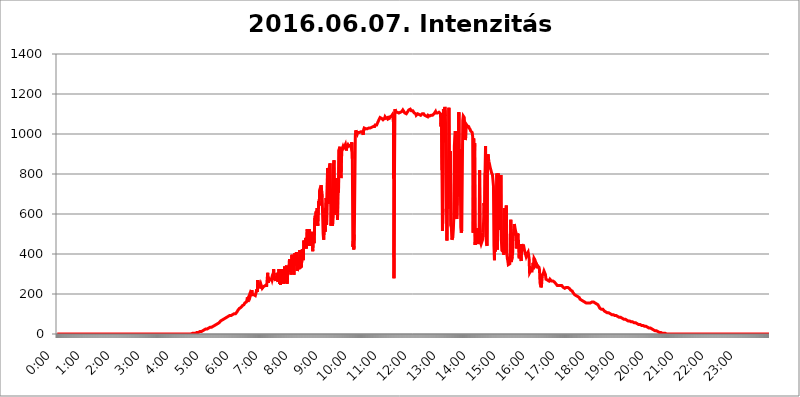
| Category | 2016.06.07. Intenzitás [W/m^2] |
|---|---|
| 0.0 | 0 |
| 0.0006944444444444445 | 0 |
| 0.001388888888888889 | 0 |
| 0.0020833333333333333 | 0 |
| 0.002777777777777778 | 0 |
| 0.003472222222222222 | 0 |
| 0.004166666666666667 | 0 |
| 0.004861111111111111 | 0 |
| 0.005555555555555556 | 0 |
| 0.0062499999999999995 | 0 |
| 0.006944444444444444 | 0 |
| 0.007638888888888889 | 0 |
| 0.008333333333333333 | 0 |
| 0.009027777777777779 | 0 |
| 0.009722222222222222 | 0 |
| 0.010416666666666666 | 0 |
| 0.011111111111111112 | 0 |
| 0.011805555555555555 | 0 |
| 0.012499999999999999 | 0 |
| 0.013194444444444444 | 0 |
| 0.013888888888888888 | 0 |
| 0.014583333333333332 | 0 |
| 0.015277777777777777 | 0 |
| 0.015972222222222224 | 0 |
| 0.016666666666666666 | 0 |
| 0.017361111111111112 | 0 |
| 0.018055555555555557 | 0 |
| 0.01875 | 0 |
| 0.019444444444444445 | 0 |
| 0.02013888888888889 | 0 |
| 0.020833333333333332 | 0 |
| 0.02152777777777778 | 0 |
| 0.022222222222222223 | 0 |
| 0.02291666666666667 | 0 |
| 0.02361111111111111 | 0 |
| 0.024305555555555556 | 0 |
| 0.024999999999999998 | 0 |
| 0.025694444444444447 | 0 |
| 0.02638888888888889 | 0 |
| 0.027083333333333334 | 0 |
| 0.027777777777777776 | 0 |
| 0.02847222222222222 | 0 |
| 0.029166666666666664 | 0 |
| 0.029861111111111113 | 0 |
| 0.030555555555555555 | 0 |
| 0.03125 | 0 |
| 0.03194444444444445 | 0 |
| 0.03263888888888889 | 0 |
| 0.03333333333333333 | 0 |
| 0.034027777777777775 | 0 |
| 0.034722222222222224 | 0 |
| 0.035416666666666666 | 0 |
| 0.036111111111111115 | 0 |
| 0.03680555555555556 | 0 |
| 0.0375 | 0 |
| 0.03819444444444444 | 0 |
| 0.03888888888888889 | 0 |
| 0.03958333333333333 | 0 |
| 0.04027777777777778 | 0 |
| 0.04097222222222222 | 0 |
| 0.041666666666666664 | 0 |
| 0.042361111111111106 | 0 |
| 0.04305555555555556 | 0 |
| 0.043750000000000004 | 0 |
| 0.044444444444444446 | 0 |
| 0.04513888888888889 | 0 |
| 0.04583333333333334 | 0 |
| 0.04652777777777778 | 0 |
| 0.04722222222222222 | 0 |
| 0.04791666666666666 | 0 |
| 0.04861111111111111 | 0 |
| 0.049305555555555554 | 0 |
| 0.049999999999999996 | 0 |
| 0.05069444444444445 | 0 |
| 0.051388888888888894 | 0 |
| 0.052083333333333336 | 0 |
| 0.05277777777777778 | 0 |
| 0.05347222222222222 | 0 |
| 0.05416666666666667 | 0 |
| 0.05486111111111111 | 0 |
| 0.05555555555555555 | 0 |
| 0.05625 | 0 |
| 0.05694444444444444 | 0 |
| 0.057638888888888885 | 0 |
| 0.05833333333333333 | 0 |
| 0.05902777777777778 | 0 |
| 0.059722222222222225 | 0 |
| 0.06041666666666667 | 0 |
| 0.061111111111111116 | 0 |
| 0.06180555555555556 | 0 |
| 0.0625 | 0 |
| 0.06319444444444444 | 0 |
| 0.06388888888888888 | 0 |
| 0.06458333333333334 | 0 |
| 0.06527777777777778 | 0 |
| 0.06597222222222222 | 0 |
| 0.06666666666666667 | 0 |
| 0.06736111111111111 | 0 |
| 0.06805555555555555 | 0 |
| 0.06874999999999999 | 0 |
| 0.06944444444444443 | 0 |
| 0.07013888888888889 | 0 |
| 0.07083333333333333 | 0 |
| 0.07152777777777779 | 0 |
| 0.07222222222222223 | 0 |
| 0.07291666666666667 | 0 |
| 0.07361111111111111 | 0 |
| 0.07430555555555556 | 0 |
| 0.075 | 0 |
| 0.07569444444444444 | 0 |
| 0.0763888888888889 | 0 |
| 0.07708333333333334 | 0 |
| 0.07777777777777778 | 0 |
| 0.07847222222222222 | 0 |
| 0.07916666666666666 | 0 |
| 0.0798611111111111 | 0 |
| 0.08055555555555556 | 0 |
| 0.08125 | 0 |
| 0.08194444444444444 | 0 |
| 0.08263888888888889 | 0 |
| 0.08333333333333333 | 0 |
| 0.08402777777777777 | 0 |
| 0.08472222222222221 | 0 |
| 0.08541666666666665 | 0 |
| 0.08611111111111112 | 0 |
| 0.08680555555555557 | 0 |
| 0.08750000000000001 | 0 |
| 0.08819444444444445 | 0 |
| 0.08888888888888889 | 0 |
| 0.08958333333333333 | 0 |
| 0.09027777777777778 | 0 |
| 0.09097222222222222 | 0 |
| 0.09166666666666667 | 0 |
| 0.09236111111111112 | 0 |
| 0.09305555555555556 | 0 |
| 0.09375 | 0 |
| 0.09444444444444444 | 0 |
| 0.09513888888888888 | 0 |
| 0.09583333333333333 | 0 |
| 0.09652777777777777 | 0 |
| 0.09722222222222222 | 0 |
| 0.09791666666666667 | 0 |
| 0.09861111111111111 | 0 |
| 0.09930555555555555 | 0 |
| 0.09999999999999999 | 0 |
| 0.10069444444444443 | 0 |
| 0.1013888888888889 | 0 |
| 0.10208333333333335 | 0 |
| 0.10277777777777779 | 0 |
| 0.10347222222222223 | 0 |
| 0.10416666666666667 | 0 |
| 0.10486111111111111 | 0 |
| 0.10555555555555556 | 0 |
| 0.10625 | 0 |
| 0.10694444444444444 | 0 |
| 0.1076388888888889 | 0 |
| 0.10833333333333334 | 0 |
| 0.10902777777777778 | 0 |
| 0.10972222222222222 | 0 |
| 0.1111111111111111 | 0 |
| 0.11180555555555556 | 0 |
| 0.11180555555555556 | 0 |
| 0.1125 | 0 |
| 0.11319444444444444 | 0 |
| 0.11388888888888889 | 0 |
| 0.11458333333333333 | 0 |
| 0.11527777777777777 | 0 |
| 0.11597222222222221 | 0 |
| 0.11666666666666665 | 0 |
| 0.1173611111111111 | 0 |
| 0.11805555555555557 | 0 |
| 0.11944444444444445 | 0 |
| 0.12013888888888889 | 0 |
| 0.12083333333333333 | 0 |
| 0.12152777777777778 | 0 |
| 0.12222222222222223 | 0 |
| 0.12291666666666667 | 0 |
| 0.12291666666666667 | 0 |
| 0.12361111111111112 | 0 |
| 0.12430555555555556 | 0 |
| 0.125 | 0 |
| 0.12569444444444444 | 0 |
| 0.12638888888888888 | 0 |
| 0.12708333333333333 | 0 |
| 0.16875 | 0 |
| 0.12847222222222224 | 0 |
| 0.12916666666666668 | 0 |
| 0.12986111111111112 | 0 |
| 0.13055555555555556 | 0 |
| 0.13125 | 0 |
| 0.13194444444444445 | 0 |
| 0.1326388888888889 | 0 |
| 0.13333333333333333 | 0 |
| 0.13402777777777777 | 0 |
| 0.13402777777777777 | 0 |
| 0.13472222222222222 | 0 |
| 0.13541666666666666 | 0 |
| 0.1361111111111111 | 0 |
| 0.13749999999999998 | 0 |
| 0.13819444444444443 | 0 |
| 0.1388888888888889 | 0 |
| 0.13958333333333334 | 0 |
| 0.14027777777777778 | 0 |
| 0.14097222222222222 | 0 |
| 0.14166666666666666 | 0 |
| 0.1423611111111111 | 0 |
| 0.14305555555555557 | 0 |
| 0.14375000000000002 | 0 |
| 0.14444444444444446 | 0 |
| 0.1451388888888889 | 0 |
| 0.1451388888888889 | 0 |
| 0.14652777777777778 | 0 |
| 0.14722222222222223 | 0 |
| 0.14791666666666667 | 0 |
| 0.1486111111111111 | 0 |
| 0.14930555555555555 | 0 |
| 0.15 | 0 |
| 0.15069444444444444 | 0 |
| 0.15138888888888888 | 0 |
| 0.15208333333333332 | 0 |
| 0.15277777777777776 | 0 |
| 0.15347222222222223 | 0 |
| 0.15416666666666667 | 0 |
| 0.15486111111111112 | 0 |
| 0.15555555555555556 | 0 |
| 0.15625 | 0 |
| 0.15694444444444444 | 0 |
| 0.15763888888888888 | 0 |
| 0.15833333333333333 | 0 |
| 0.15902777777777777 | 0 |
| 0.15972222222222224 | 0 |
| 0.16041666666666668 | 0 |
| 0.16111111111111112 | 0 |
| 0.16180555555555556 | 0 |
| 0.1625 | 0 |
| 0.16319444444444445 | 0 |
| 0.1638888888888889 | 0 |
| 0.16458333333333333 | 0 |
| 0.16527777777777777 | 0 |
| 0.16597222222222222 | 0 |
| 0.16666666666666666 | 0 |
| 0.1673611111111111 | 0 |
| 0.16805555555555554 | 0 |
| 0.16874999999999998 | 0 |
| 0.16944444444444443 | 0 |
| 0.17013888888888887 | 0 |
| 0.1708333333333333 | 0 |
| 0.17152777777777775 | 0 |
| 0.17222222222222225 | 0 |
| 0.1729166666666667 | 0 |
| 0.17361111111111113 | 0 |
| 0.17430555555555557 | 0 |
| 0.17500000000000002 | 0 |
| 0.17569444444444446 | 0 |
| 0.1763888888888889 | 0 |
| 0.17708333333333334 | 0 |
| 0.17777777777777778 | 0 |
| 0.17847222222222223 | 0 |
| 0.17916666666666667 | 0 |
| 0.1798611111111111 | 0 |
| 0.18055555555555555 | 0 |
| 0.18125 | 0 |
| 0.18194444444444444 | 0 |
| 0.1826388888888889 | 0 |
| 0.18333333333333335 | 0 |
| 0.1840277777777778 | 0 |
| 0.18472222222222223 | 0 |
| 0.18541666666666667 | 0 |
| 0.18611111111111112 | 0 |
| 0.18680555555555556 | 0 |
| 0.1875 | 0 |
| 0.18819444444444444 | 0 |
| 0.18888888888888888 | 0 |
| 0.18958333333333333 | 3.525 |
| 0.19027777777777777 | 3.525 |
| 0.1909722222222222 | 3.525 |
| 0.19166666666666665 | 3.525 |
| 0.19236111111111112 | 3.525 |
| 0.19305555555555554 | 3.525 |
| 0.19375 | 3.525 |
| 0.19444444444444445 | 3.525 |
| 0.1951388888888889 | 3.525 |
| 0.19583333333333333 | 7.887 |
| 0.19652777777777777 | 7.887 |
| 0.19722222222222222 | 7.887 |
| 0.19791666666666666 | 7.887 |
| 0.1986111111111111 | 7.887 |
| 0.19930555555555554 | 12.257 |
| 0.19999999999999998 | 12.257 |
| 0.20069444444444443 | 12.257 |
| 0.20138888888888887 | 12.257 |
| 0.2020833333333333 | 12.257 |
| 0.2027777777777778 | 12.257 |
| 0.2034722222222222 | 16.636 |
| 0.2041666666666667 | 16.636 |
| 0.20486111111111113 | 16.636 |
| 0.20555555555555557 | 16.636 |
| 0.20625000000000002 | 21.024 |
| 0.20694444444444446 | 21.024 |
| 0.2076388888888889 | 21.024 |
| 0.20833333333333334 | 25.419 |
| 0.20902777777777778 | 25.419 |
| 0.20972222222222223 | 29.823 |
| 0.21041666666666667 | 25.419 |
| 0.2111111111111111 | 29.823 |
| 0.21180555555555555 | 29.823 |
| 0.2125 | 29.823 |
| 0.21319444444444444 | 29.823 |
| 0.2138888888888889 | 29.823 |
| 0.21458333333333335 | 34.234 |
| 0.2152777777777778 | 34.234 |
| 0.21597222222222223 | 34.234 |
| 0.21666666666666667 | 34.234 |
| 0.21736111111111112 | 38.653 |
| 0.21805555555555556 | 38.653 |
| 0.21875 | 38.653 |
| 0.21944444444444444 | 38.653 |
| 0.22013888888888888 | 43.079 |
| 0.22083333333333333 | 43.079 |
| 0.22152777777777777 | 47.511 |
| 0.2222222222222222 | 47.511 |
| 0.22291666666666665 | 47.511 |
| 0.2236111111111111 | 47.511 |
| 0.22430555555555556 | 51.951 |
| 0.225 | 51.951 |
| 0.22569444444444445 | 56.398 |
| 0.2263888888888889 | 56.398 |
| 0.22708333333333333 | 56.398 |
| 0.22777777777777777 | 60.85 |
| 0.22847222222222222 | 60.85 |
| 0.22916666666666666 | 65.31 |
| 0.2298611111111111 | 65.31 |
| 0.23055555555555554 | 69.775 |
| 0.23124999999999998 | 69.775 |
| 0.23194444444444443 | 74.246 |
| 0.23263888888888887 | 74.246 |
| 0.2333333333333333 | 74.246 |
| 0.2340277777777778 | 78.722 |
| 0.2347222222222222 | 78.722 |
| 0.2354166666666667 | 78.722 |
| 0.23611111111111113 | 83.205 |
| 0.23680555555555557 | 83.205 |
| 0.23750000000000002 | 83.205 |
| 0.23819444444444446 | 83.205 |
| 0.2388888888888889 | 83.205 |
| 0.23958333333333334 | 87.692 |
| 0.24027777777777778 | 87.692 |
| 0.24097222222222223 | 92.184 |
| 0.24166666666666667 | 92.184 |
| 0.2423611111111111 | 92.184 |
| 0.24305555555555555 | 92.184 |
| 0.24375 | 92.184 |
| 0.24444444444444446 | 96.682 |
| 0.24513888888888888 | 96.682 |
| 0.24583333333333335 | 96.682 |
| 0.2465277777777778 | 96.682 |
| 0.24722222222222223 | 101.184 |
| 0.24791666666666667 | 101.184 |
| 0.24861111111111112 | 101.184 |
| 0.24930555555555556 | 101.184 |
| 0.25 | 101.184 |
| 0.25069444444444444 | 105.69 |
| 0.2513888888888889 | 105.69 |
| 0.2520833333333333 | 110.201 |
| 0.25277777777777777 | 114.716 |
| 0.2534722222222222 | 119.235 |
| 0.25416666666666665 | 123.758 |
| 0.2548611111111111 | 123.758 |
| 0.2555555555555556 | 128.284 |
| 0.25625000000000003 | 128.284 |
| 0.2569444444444445 | 132.814 |
| 0.2576388888888889 | 132.814 |
| 0.25833333333333336 | 137.347 |
| 0.2590277777777778 | 137.347 |
| 0.25972222222222224 | 141.884 |
| 0.2604166666666667 | 141.884 |
| 0.2611111111111111 | 146.423 |
| 0.26180555555555557 | 146.423 |
| 0.2625 | 150.964 |
| 0.26319444444444445 | 155.509 |
| 0.2638888888888889 | 155.509 |
| 0.26458333333333334 | 160.056 |
| 0.2652777777777778 | 160.056 |
| 0.2659722222222222 | 169.156 |
| 0.26666666666666666 | 182.82 |
| 0.2673611111111111 | 160.056 |
| 0.26805555555555555 | 164.605 |
| 0.26875 | 187.378 |
| 0.26944444444444443 | 182.82 |
| 0.2701388888888889 | 201.058 |
| 0.2708333333333333 | 191.937 |
| 0.27152777777777776 | 187.378 |
| 0.2722222222222222 | 196.497 |
| 0.27291666666666664 | 219.309 |
| 0.2736111111111111 | 196.497 |
| 0.2743055555555555 | 191.937 |
| 0.27499999999999997 | 201.058 |
| 0.27569444444444446 | 196.497 |
| 0.27638888888888885 | 201.058 |
| 0.27708333333333335 | 196.497 |
| 0.2777777777777778 | 191.937 |
| 0.27847222222222223 | 191.937 |
| 0.2791666666666667 | 210.182 |
| 0.2798611111111111 | 223.873 |
| 0.28055555555555556 | 210.182 |
| 0.28125 | 269.49 |
| 0.28194444444444444 | 255.813 |
| 0.2826388888888889 | 242.127 |
| 0.2833333333333333 | 228.436 |
| 0.28402777777777777 | 228.436 |
| 0.2847222222222222 | 228.436 |
| 0.28541666666666665 | 251.251 |
| 0.28611111111111115 | 251.251 |
| 0.28680555555555554 | 251.251 |
| 0.28750000000000003 | 228.436 |
| 0.2881944444444445 | 233 |
| 0.2888888888888889 | 233 |
| 0.28958333333333336 | 237.564 |
| 0.2902777777777778 | 237.564 |
| 0.29097222222222224 | 242.127 |
| 0.2916666666666667 | 242.127 |
| 0.2923611111111111 | 242.127 |
| 0.29305555555555557 | 246.689 |
| 0.29375 | 242.127 |
| 0.29444444444444445 | 246.689 |
| 0.2951388888888889 | 305.898 |
| 0.29583333333333334 | 255.813 |
| 0.2965277777777778 | 278.603 |
| 0.2972222222222222 | 274.047 |
| 0.29791666666666666 | 269.49 |
| 0.2986111111111111 | 269.49 |
| 0.29930555555555555 | 264.932 |
| 0.3 | 269.49 |
| 0.30069444444444443 | 278.603 |
| 0.3013888888888889 | 269.49 |
| 0.3020833333333333 | 278.603 |
| 0.30277777777777776 | 269.49 |
| 0.3034722222222222 | 324.052 |
| 0.30416666666666664 | 287.709 |
| 0.3048611111111111 | 287.709 |
| 0.3055555555555555 | 278.603 |
| 0.30624999999999997 | 264.932 |
| 0.3069444444444444 | 260.373 |
| 0.3076388888888889 | 287.709 |
| 0.30833333333333335 | 305.898 |
| 0.3090277777777778 | 274.047 |
| 0.30972222222222223 | 260.373 |
| 0.3104166666666667 | 264.932 |
| 0.3111111111111111 | 324.052 |
| 0.31180555555555556 | 251.251 |
| 0.3125 | 264.932 |
| 0.31319444444444444 | 246.689 |
| 0.3138888888888889 | 278.603 |
| 0.3145833333333333 | 324.052 |
| 0.31527777777777777 | 278.603 |
| 0.3159722222222222 | 292.259 |
| 0.31666666666666665 | 274.047 |
| 0.31736111111111115 | 251.251 |
| 0.31805555555555554 | 264.932 |
| 0.31875000000000003 | 337.639 |
| 0.3194444444444445 | 255.813 |
| 0.3201388888888889 | 310.44 |
| 0.32083333333333336 | 333.113 |
| 0.3215277777777778 | 342.162 |
| 0.32222222222222224 | 251.251 |
| 0.3229166666666667 | 274.047 |
| 0.3236111111111111 | 337.639 |
| 0.32430555555555557 | 328.584 |
| 0.325 | 337.639 |
| 0.32569444444444445 | 373.729 |
| 0.3263888888888889 | 337.639 |
| 0.32708333333333334 | 333.113 |
| 0.3277777777777778 | 296.808 |
| 0.3284722222222222 | 301.354 |
| 0.32916666666666666 | 396.164 |
| 0.3298611111111111 | 378.224 |
| 0.33055555555555555 | 391.685 |
| 0.33125 | 333.113 |
| 0.33194444444444443 | 296.808 |
| 0.3326388888888889 | 346.682 |
| 0.3333333333333333 | 405.108 |
| 0.3340277777777778 | 360.221 |
| 0.3347222222222222 | 346.682 |
| 0.3354166666666667 | 409.574 |
| 0.3361111111111111 | 405.108 |
| 0.3368055555555556 | 314.98 |
| 0.33749999999999997 | 328.584 |
| 0.33819444444444446 | 382.715 |
| 0.33888888888888885 | 333.113 |
| 0.33958333333333335 | 324.052 |
| 0.34027777777777773 | 418.492 |
| 0.34097222222222223 | 328.584 |
| 0.3416666666666666 | 396.164 |
| 0.3423611111111111 | 333.113 |
| 0.3430555555555555 | 333.113 |
| 0.34375 | 422.943 |
| 0.3444444444444445 | 414.035 |
| 0.3451388888888889 | 369.23 |
| 0.3458333333333334 | 467.187 |
| 0.34652777777777777 | 458.38 |
| 0.34722222222222227 | 462.786 |
| 0.34791666666666665 | 431.833 |
| 0.34861111111111115 | 480.356 |
| 0.34930555555555554 | 427.39 |
| 0.35000000000000003 | 427.39 |
| 0.3506944444444444 | 523.88 |
| 0.3513888888888889 | 462.786 |
| 0.3520833333333333 | 510.885 |
| 0.3527777777777778 | 471.582 |
| 0.3534722222222222 | 523.88 |
| 0.3541666666666667 | 440.702 |
| 0.3548611111111111 | 497.836 |
| 0.35555555555555557 | 471.582 |
| 0.35625 | 484.735 |
| 0.35694444444444445 | 510.885 |
| 0.3576388888888889 | 458.38 |
| 0.35833333333333334 | 414.035 |
| 0.3590277777777778 | 475.972 |
| 0.3597222222222222 | 462.786 |
| 0.36041666666666666 | 453.968 |
| 0.3611111111111111 | 579.542 |
| 0.36180555555555555 | 592.233 |
| 0.3625 | 575.299 |
| 0.36319444444444443 | 613.252 |
| 0.3638888888888889 | 558.261 |
| 0.3645833333333333 | 629.948 |
| 0.3652777777777778 | 541.121 |
| 0.3659722222222222 | 545.416 |
| 0.3666666666666667 | 663.019 |
| 0.3673611111111111 | 642.4 |
| 0.3680555555555556 | 719.877 |
| 0.36874999999999997 | 723.889 |
| 0.36944444444444446 | 723.889 |
| 0.37013888888888885 | 743.859 |
| 0.37083333333333335 | 743.859 |
| 0.37152777777777773 | 683.473 |
| 0.37222222222222223 | 679.395 |
| 0.3729166666666666 | 502.192 |
| 0.3736111111111111 | 471.582 |
| 0.3743055555555555 | 467.187 |
| 0.375 | 566.793 |
| 0.3756944444444445 | 510.885 |
| 0.3763888888888889 | 629.948 |
| 0.3770833333333334 | 679.395 |
| 0.37777777777777777 | 545.416 |
| 0.37847222222222227 | 545.416 |
| 0.37916666666666665 | 829.981 |
| 0.37986111111111115 | 650.667 |
| 0.38055555555555554 | 763.674 |
| 0.38125000000000003 | 826.123 |
| 0.3819444444444444 | 841.526 |
| 0.3826388888888889 | 853.029 |
| 0.3833333333333333 | 687.544 |
| 0.3840277777777778 | 541.121 |
| 0.3847222222222222 | 650.667 |
| 0.3854166666666667 | 727.896 |
| 0.3861111111111111 | 541.121 |
| 0.38680555555555557 | 596.45 |
| 0.3875 | 849.199 |
| 0.38819444444444445 | 868.305 |
| 0.3888888888888889 | 596.45 |
| 0.38958333333333334 | 658.909 |
| 0.3902777777777778 | 609.062 |
| 0.3909722222222222 | 779.42 |
| 0.39166666666666666 | 751.803 |
| 0.3923611111111111 | 755.766 |
| 0.39305555555555555 | 571.049 |
| 0.39375 | 739.877 |
| 0.39444444444444443 | 707.8 |
| 0.3951388888888889 | 921.298 |
| 0.3958333333333333 | 925.06 |
| 0.3965277777777778 | 936.33 |
| 0.3972222222222222 | 868.305 |
| 0.3979166666666667 | 779.42 |
| 0.3986111111111111 | 872.114 |
| 0.3993055555555556 | 921.298 |
| 0.39999999999999997 | 928.819 |
| 0.40069444444444446 | 936.33 |
| 0.40138888888888885 | 928.819 |
| 0.40208333333333335 | 928.819 |
| 0.40277777777777773 | 936.33 |
| 0.40347222222222223 | 940.082 |
| 0.4041666666666666 | 947.58 |
| 0.4048611111111111 | 947.58 |
| 0.4055555555555555 | 917.534 |
| 0.40625 | 940.082 |
| 0.4069444444444445 | 940.082 |
| 0.4076388888888889 | 947.58 |
| 0.4083333333333334 | 943.832 |
| 0.40902777777777777 | 940.082 |
| 0.40972222222222227 | 940.082 |
| 0.41041666666666665 | 943.832 |
| 0.41111111111111115 | 943.832 |
| 0.41180555555555554 | 936.33 |
| 0.41250000000000003 | 947.58 |
| 0.4131944444444444 | 958.814 |
| 0.4138888888888889 | 875.918 |
| 0.4145833333333333 | 436.27 |
| 0.4152777777777778 | 462.786 |
| 0.4159722222222222 | 422.943 |
| 0.4166666666666667 | 497.836 |
| 0.4173611111111111 | 493.475 |
| 0.41805555555555557 | 992.448 |
| 0.41875 | 1018.587 |
| 0.41944444444444445 | 1011.118 |
| 0.4201388888888889 | 1007.383 |
| 0.42083333333333334 | 999.916 |
| 0.4215277777777778 | 1007.383 |
| 0.4222222222222222 | 1007.383 |
| 0.42291666666666666 | 1007.383 |
| 0.4236111111111111 | 1007.383 |
| 0.42430555555555555 | 1011.118 |
| 0.425 | 1011.118 |
| 0.42569444444444443 | 1011.118 |
| 0.4263888888888889 | 1011.118 |
| 0.4270833333333333 | 1014.852 |
| 0.4277777777777778 | 1011.118 |
| 0.4284722222222222 | 1011.118 |
| 0.4291666666666667 | 996.182 |
| 0.4298611111111111 | 1022.323 |
| 0.4305555555555556 | 1029.798 |
| 0.43124999999999997 | 1029.798 |
| 0.43194444444444446 | 1026.06 |
| 0.43263888888888885 | 1026.06 |
| 0.43333333333333335 | 1022.323 |
| 0.43402777777777773 | 1026.06 |
| 0.43472222222222223 | 1026.06 |
| 0.4354166666666666 | 1026.06 |
| 0.4361111111111111 | 1029.798 |
| 0.4368055555555555 | 1029.798 |
| 0.4375 | 1029.798 |
| 0.4381944444444445 | 1029.798 |
| 0.4388888888888889 | 1029.798 |
| 0.4395833333333334 | 1033.537 |
| 0.44027777777777777 | 1033.537 |
| 0.44097222222222227 | 1033.537 |
| 0.44166666666666665 | 1033.537 |
| 0.44236111111111115 | 1037.277 |
| 0.44305555555555554 | 1037.277 |
| 0.44375000000000003 | 1041.019 |
| 0.4444444444444444 | 1041.019 |
| 0.4451388888888889 | 1037.277 |
| 0.4458333333333333 | 1044.762 |
| 0.4465277777777778 | 1044.762 |
| 0.4472222222222222 | 1044.762 |
| 0.4479166666666667 | 1044.762 |
| 0.4486111111111111 | 1044.762 |
| 0.44930555555555557 | 1056.004 |
| 0.45 | 1059.756 |
| 0.45069444444444445 | 1067.267 |
| 0.4513888888888889 | 1067.267 |
| 0.45208333333333334 | 1071.027 |
| 0.4527777777777778 | 1082.324 |
| 0.4534722222222222 | 1082.324 |
| 0.45416666666666666 | 1082.324 |
| 0.4548611111111111 | 1078.555 |
| 0.45555555555555555 | 1078.555 |
| 0.45625 | 1074.789 |
| 0.45694444444444443 | 1071.027 |
| 0.4576388888888889 | 1074.789 |
| 0.4583333333333333 | 1074.789 |
| 0.4590277777777778 | 1078.555 |
| 0.4597222222222222 | 1086.097 |
| 0.4604166666666667 | 1086.097 |
| 0.4611111111111111 | 1078.555 |
| 0.4618055555555556 | 1078.555 |
| 0.46249999999999997 | 1082.324 |
| 0.46319444444444446 | 1082.324 |
| 0.46388888888888885 | 1074.789 |
| 0.46458333333333335 | 1071.027 |
| 0.46527777777777773 | 1074.789 |
| 0.46597222222222223 | 1078.555 |
| 0.4666666666666666 | 1086.097 |
| 0.4673611111111111 | 1086.097 |
| 0.4680555555555555 | 1089.873 |
| 0.46875 | 1089.873 |
| 0.4694444444444445 | 1093.653 |
| 0.4701388888888889 | 1097.437 |
| 0.4708333333333334 | 1101.226 |
| 0.47152777777777777 | 1059.756 |
| 0.47222222222222227 | 278.603 |
| 0.47291666666666665 | 771.559 |
| 0.47361111111111115 | 1124.056 |
| 0.47430555555555554 | 1116.426 |
| 0.47500000000000003 | 1108.816 |
| 0.4756944444444444 | 1108.816 |
| 0.4763888888888889 | 1108.816 |
| 0.4770833333333333 | 1108.816 |
| 0.4777777777777778 | 1105.019 |
| 0.4784722222222222 | 1108.816 |
| 0.4791666666666667 | 1105.019 |
| 0.4798611111111111 | 1101.226 |
| 0.48055555555555557 | 1105.019 |
| 0.48125 | 1108.816 |
| 0.48194444444444445 | 1105.019 |
| 0.4826388888888889 | 1108.816 |
| 0.48333333333333334 | 1112.618 |
| 0.4840277777777778 | 1112.618 |
| 0.4847222222222222 | 1120.238 |
| 0.48541666666666666 | 1116.426 |
| 0.4861111111111111 | 1112.618 |
| 0.48680555555555555 | 1112.618 |
| 0.4875 | 1105.019 |
| 0.48819444444444443 | 1101.226 |
| 0.4888888888888889 | 1101.226 |
| 0.4895833333333333 | 1101.226 |
| 0.4902777777777778 | 1101.226 |
| 0.4909722222222222 | 1108.816 |
| 0.4916666666666667 | 1108.816 |
| 0.4923611111111111 | 1112.618 |
| 0.4930555555555556 | 1120.238 |
| 0.49374999999999997 | 1120.238 |
| 0.49444444444444446 | 1124.056 |
| 0.49513888888888885 | 1124.056 |
| 0.49583333333333335 | 1120.238 |
| 0.49652777777777773 | 1116.426 |
| 0.49722222222222223 | 1116.426 |
| 0.4979166666666666 | 1116.426 |
| 0.4986111111111111 | 1116.426 |
| 0.4993055555555555 | 1116.426 |
| 0.5 | 1112.618 |
| 0.5006944444444444 | 1105.019 |
| 0.5013888888888889 | 1101.226 |
| 0.5020833333333333 | 1101.226 |
| 0.5027777777777778 | 1101.226 |
| 0.5034722222222222 | 1093.653 |
| 0.5041666666666667 | 1097.437 |
| 0.5048611111111111 | 1097.437 |
| 0.5055555555555555 | 1101.226 |
| 0.50625 | 1101.226 |
| 0.5069444444444444 | 1097.437 |
| 0.5076388888888889 | 1097.437 |
| 0.5083333333333333 | 1097.437 |
| 0.5090277777777777 | 1093.653 |
| 0.5097222222222222 | 1093.653 |
| 0.5104166666666666 | 1093.653 |
| 0.5111111111111112 | 1097.437 |
| 0.5118055555555555 | 1101.226 |
| 0.5125000000000001 | 1101.226 |
| 0.5131944444444444 | 1105.019 |
| 0.513888888888889 | 1101.226 |
| 0.5145833333333333 | 1097.437 |
| 0.5152777777777778 | 1093.653 |
| 0.5159722222222222 | 1089.873 |
| 0.5166666666666667 | 1089.873 |
| 0.517361111111111 | 1089.873 |
| 0.5180555555555556 | 1089.873 |
| 0.5187499999999999 | 1089.873 |
| 0.5194444444444445 | 1086.097 |
| 0.5201388888888888 | 1093.653 |
| 0.5208333333333334 | 1093.653 |
| 0.5215277777777778 | 1089.873 |
| 0.5222222222222223 | 1089.873 |
| 0.5229166666666667 | 1089.873 |
| 0.5236111111111111 | 1089.873 |
| 0.5243055555555556 | 1093.653 |
| 0.525 | 1097.437 |
| 0.5256944444444445 | 1097.437 |
| 0.5263888888888889 | 1093.653 |
| 0.5270833333333333 | 1097.437 |
| 0.5277777777777778 | 1093.653 |
| 0.5284722222222222 | 1101.226 |
| 0.5291666666666667 | 1101.226 |
| 0.5298611111111111 | 1105.019 |
| 0.5305555555555556 | 1112.618 |
| 0.53125 | 1105.019 |
| 0.5319444444444444 | 1101.226 |
| 0.5326388888888889 | 1105.019 |
| 0.5333333333333333 | 1105.019 |
| 0.5340277777777778 | 1108.816 |
| 0.5347222222222222 | 1101.226 |
| 0.5354166666666667 | 1108.816 |
| 0.5361111111111111 | 1108.816 |
| 0.5368055555555555 | 1105.019 |
| 0.5375 | 1101.226 |
| 0.5381944444444444 | 1037.277 |
| 0.5388888888888889 | 1101.226 |
| 0.5395833333333333 | 818.392 |
| 0.5402777777777777 | 515.223 |
| 0.5409722222222222 | 625.784 |
| 0.5416666666666666 | 1124.056 |
| 0.5423611111111112 | 958.814 |
| 0.5430555555555555 | 1124.056 |
| 0.5437500000000001 | 1135.543 |
| 0.5444444444444444 | 1089.873 |
| 0.545138888888889 | 826.123 |
| 0.5458333333333333 | 658.909 |
| 0.5465277777777778 | 467.187 |
| 0.5472222222222222 | 743.859 |
| 0.5479166666666667 | 625.784 |
| 0.548611111111111 | 802.868 |
| 0.5493055555555556 | 1131.708 |
| 0.5499999999999999 | 791.169 |
| 0.5506944444444445 | 755.766 |
| 0.5513888888888888 | 913.766 |
| 0.5520833333333334 | 541.121 |
| 0.5527777777777778 | 532.513 |
| 0.5534722222222223 | 471.582 |
| 0.5541666666666667 | 471.582 |
| 0.5548611111111111 | 484.735 |
| 0.5555555555555556 | 523.88 |
| 0.55625 | 588.009 |
| 0.5569444444444445 | 940.082 |
| 0.5576388888888889 | 984.98 |
| 0.5583333333333333 | 1014.852 |
| 0.5590277777777778 | 604.864 |
| 0.5597222222222222 | 592.233 |
| 0.5604166666666667 | 575.299 |
| 0.5611111111111111 | 683.473 |
| 0.5618055555555556 | 894.885 |
| 0.5625 | 687.544 |
| 0.5631944444444444 | 1108.816 |
| 0.5638888888888889 | 775.492 |
| 0.5645833333333333 | 925.06 |
| 0.5652777777777778 | 814.519 |
| 0.5659722222222222 | 532.513 |
| 0.5666666666666667 | 506.542 |
| 0.5673611111111111 | 519.555 |
| 0.5680555555555555 | 523.88 |
| 0.56875 | 1067.267 |
| 0.5694444444444444 | 1089.873 |
| 0.5701388888888889 | 1086.097 |
| 0.5708333333333333 | 1082.324 |
| 0.5715277777777777 | 1082.324 |
| 0.5722222222222222 | 970.034 |
| 0.5729166666666666 | 984.98 |
| 0.5736111111111112 | 1048.508 |
| 0.5743055555555555 | 1044.762 |
| 0.5750000000000001 | 1041.019 |
| 0.5756944444444444 | 1037.277 |
| 0.576388888888889 | 1037.277 |
| 0.5770833333333333 | 1037.277 |
| 0.5777777777777778 | 1029.798 |
| 0.5784722222222222 | 1026.06 |
| 0.5791666666666667 | 1022.323 |
| 0.579861111111111 | 1014.852 |
| 0.5805555555555556 | 1018.587 |
| 0.5812499999999999 | 1011.118 |
| 0.5819444444444445 | 1007.383 |
| 0.5826388888888888 | 988.714 |
| 0.5833333333333334 | 506.542 |
| 0.5840277777777778 | 977.508 |
| 0.5847222222222223 | 787.258 |
| 0.5854166666666667 | 955.071 |
| 0.5861111111111111 | 445.129 |
| 0.5868055555555556 | 449.551 |
| 0.5875 | 506.542 |
| 0.5881944444444445 | 471.582 |
| 0.5888888888888889 | 528.2 |
| 0.5895833333333333 | 462.786 |
| 0.5902777777777778 | 449.551 |
| 0.5909722222222222 | 462.786 |
| 0.5916666666666667 | 471.582 |
| 0.5923611111111111 | 818.392 |
| 0.5930555555555556 | 480.356 |
| 0.59375 | 458.38 |
| 0.5944444444444444 | 449.551 |
| 0.5951388888888889 | 449.551 |
| 0.5958333333333333 | 453.968 |
| 0.5965277777777778 | 471.582 |
| 0.5972222222222222 | 506.542 |
| 0.5979166666666667 | 558.261 |
| 0.5986111111111111 | 654.791 |
| 0.5993055555555555 | 575.299 |
| 0.6 | 806.757 |
| 0.6006944444444444 | 940.082 |
| 0.6013888888888889 | 484.735 |
| 0.6020833333333333 | 453.968 |
| 0.6027777777777777 | 440.702 |
| 0.6034722222222222 | 872.114 |
| 0.6041666666666666 | 898.668 |
| 0.6048611111111112 | 875.918 |
| 0.6055555555555555 | 860.676 |
| 0.6062500000000001 | 849.199 |
| 0.6069444444444444 | 837.682 |
| 0.607638888888889 | 826.123 |
| 0.6083333333333333 | 818.392 |
| 0.6090277777777778 | 806.757 |
| 0.6097222222222222 | 802.868 |
| 0.6104166666666667 | 795.074 |
| 0.611111111111111 | 795.074 |
| 0.6118055555555556 | 739.877 |
| 0.6124999999999999 | 440.702 |
| 0.6131944444444445 | 369.23 |
| 0.6138888888888888 | 484.735 |
| 0.6145833333333334 | 414.035 |
| 0.6152777777777778 | 418.492 |
| 0.6159722222222223 | 695.666 |
| 0.6166666666666667 | 802.868 |
| 0.6173611111111111 | 422.943 |
| 0.6180555555555556 | 791.169 |
| 0.61875 | 802.868 |
| 0.6194444444444445 | 671.22 |
| 0.6201388888888889 | 795.074 |
| 0.6208333333333333 | 519.555 |
| 0.6215277777777778 | 621.613 |
| 0.6222222222222222 | 795.074 |
| 0.6229166666666667 | 467.187 |
| 0.6236111111111111 | 418.492 |
| 0.6243055555555556 | 422.943 |
| 0.625 | 414.035 |
| 0.6256944444444444 | 409.574 |
| 0.6263888888888889 | 396.164 |
| 0.6270833333333333 | 629.948 |
| 0.6277777777777778 | 613.252 |
| 0.6284722222222222 | 405.108 |
| 0.6291666666666667 | 418.492 |
| 0.6298611111111111 | 642.4 |
| 0.6305555555555555 | 400.638 |
| 0.63125 | 378.224 |
| 0.6319444444444444 | 364.728 |
| 0.6326388888888889 | 346.682 |
| 0.6333333333333333 | 342.162 |
| 0.6340277777777777 | 346.682 |
| 0.6347222222222222 | 351.198 |
| 0.6354166666666666 | 369.23 |
| 0.6361111111111112 | 571.049 |
| 0.6368055555555555 | 360.221 |
| 0.6375000000000001 | 364.728 |
| 0.6381944444444444 | 387.202 |
| 0.638888888888889 | 414.035 |
| 0.6395833333333333 | 484.735 |
| 0.6402777777777778 | 480.356 |
| 0.6409722222222222 | 549.704 |
| 0.6416666666666667 | 536.82 |
| 0.642361111111111 | 523.88 |
| 0.6430555555555556 | 510.885 |
| 0.6437499999999999 | 502.192 |
| 0.6444444444444445 | 427.39 |
| 0.6451388888888888 | 458.38 |
| 0.6458333333333334 | 502.192 |
| 0.6465277777777778 | 493.475 |
| 0.6472222222222223 | 422.943 |
| 0.6479166666666667 | 378.224 |
| 0.6486111111111111 | 445.129 |
| 0.6493055555555556 | 427.39 |
| 0.65 | 382.715 |
| 0.6506944444444445 | 364.728 |
| 0.6513888888888889 | 449.551 |
| 0.6520833333333333 | 440.702 |
| 0.6527777777777778 | 436.27 |
| 0.6534722222222222 | 440.702 |
| 0.6541666666666667 | 440.702 |
| 0.6548611111111111 | 427.39 |
| 0.6555555555555556 | 414.035 |
| 0.65625 | 405.108 |
| 0.6569444444444444 | 400.638 |
| 0.6576388888888889 | 387.202 |
| 0.6583333333333333 | 391.685 |
| 0.6590277777777778 | 400.638 |
| 0.6597222222222222 | 405.108 |
| 0.6604166666666667 | 409.574 |
| 0.6611111111111111 | 409.574 |
| 0.6618055555555555 | 378.224 |
| 0.6625 | 305.898 |
| 0.6631944444444444 | 305.898 |
| 0.6638888888888889 | 314.98 |
| 0.6645833333333333 | 310.44 |
| 0.6652777777777777 | 310.44 |
| 0.6659722222222222 | 314.98 |
| 0.6666666666666666 | 314.98 |
| 0.6673611111111111 | 355.712 |
| 0.6680555555555556 | 324.052 |
| 0.6687500000000001 | 378.224 |
| 0.6694444444444444 | 378.224 |
| 0.6701388888888888 | 369.23 |
| 0.6708333333333334 | 360.221 |
| 0.6715277777777778 | 355.712 |
| 0.6722222222222222 | 351.198 |
| 0.6729166666666666 | 328.584 |
| 0.6736111111111112 | 342.162 |
| 0.6743055555555556 | 342.162 |
| 0.6749999999999999 | 346.682 |
| 0.6756944444444444 | 333.113 |
| 0.6763888888888889 | 319.517 |
| 0.6770833333333334 | 255.813 |
| 0.6777777777777777 | 260.373 |
| 0.6784722222222223 | 233 |
| 0.6791666666666667 | 242.127 |
| 0.6798611111111111 | 274.047 |
| 0.6805555555555555 | 296.808 |
| 0.68125 | 301.354 |
| 0.6819444444444445 | 305.898 |
| 0.6826388888888889 | 314.98 |
| 0.6833333333333332 | 314.98 |
| 0.6840277777777778 | 310.44 |
| 0.6847222222222222 | 296.808 |
| 0.6854166666666667 | 274.047 |
| 0.686111111111111 | 269.49 |
| 0.6868055555555556 | 269.49 |
| 0.6875 | 269.49 |
| 0.6881944444444444 | 269.49 |
| 0.688888888888889 | 264.932 |
| 0.6895833333333333 | 264.932 |
| 0.6902777777777778 | 269.49 |
| 0.6909722222222222 | 274.047 |
| 0.6916666666666668 | 274.047 |
| 0.6923611111111111 | 269.49 |
| 0.6930555555555555 | 264.932 |
| 0.69375 | 264.932 |
| 0.6944444444444445 | 264.932 |
| 0.6951388888888889 | 264.932 |
| 0.6958333333333333 | 264.932 |
| 0.6965277777777777 | 260.373 |
| 0.6972222222222223 | 260.373 |
| 0.6979166666666666 | 260.373 |
| 0.6986111111111111 | 255.813 |
| 0.6993055555555556 | 251.251 |
| 0.7000000000000001 | 246.689 |
| 0.7006944444444444 | 246.689 |
| 0.7013888888888888 | 242.127 |
| 0.7020833333333334 | 242.127 |
| 0.7027777777777778 | 242.127 |
| 0.7034722222222222 | 242.127 |
| 0.7041666666666666 | 246.689 |
| 0.7048611111111112 | 246.689 |
| 0.7055555555555556 | 242.127 |
| 0.7062499999999999 | 242.127 |
| 0.7069444444444444 | 242.127 |
| 0.7076388888888889 | 242.127 |
| 0.7083333333333334 | 242.127 |
| 0.7090277777777777 | 237.564 |
| 0.7097222222222223 | 233 |
| 0.7104166666666667 | 228.436 |
| 0.7111111111111111 | 228.436 |
| 0.7118055555555555 | 228.436 |
| 0.7125 | 228.436 |
| 0.7131944444444445 | 228.436 |
| 0.7138888888888889 | 233 |
| 0.7145833333333332 | 233 |
| 0.7152777777777778 | 233 |
| 0.7159722222222222 | 233 |
| 0.7166666666666667 | 233 |
| 0.717361111111111 | 233 |
| 0.7180555555555556 | 228.436 |
| 0.71875 | 228.436 |
| 0.7194444444444444 | 223.873 |
| 0.720138888888889 | 219.309 |
| 0.7208333333333333 | 219.309 |
| 0.7215277777777778 | 219.309 |
| 0.7222222222222222 | 214.746 |
| 0.7229166666666668 | 210.182 |
| 0.7236111111111111 | 205.62 |
| 0.7243055555555555 | 201.058 |
| 0.725 | 201.058 |
| 0.7256944444444445 | 196.497 |
| 0.7263888888888889 | 191.937 |
| 0.7270833333333333 | 191.937 |
| 0.7277777777777777 | 191.937 |
| 0.7284722222222223 | 187.378 |
| 0.7291666666666666 | 187.378 |
| 0.7298611111111111 | 187.378 |
| 0.7305555555555556 | 187.378 |
| 0.7312500000000001 | 187.378 |
| 0.7319444444444444 | 182.82 |
| 0.7326388888888888 | 178.264 |
| 0.7333333333333334 | 173.709 |
| 0.7340277777777778 | 169.156 |
| 0.7347222222222222 | 169.156 |
| 0.7354166666666666 | 169.156 |
| 0.7361111111111112 | 164.605 |
| 0.7368055555555556 | 164.605 |
| 0.7374999999999999 | 164.605 |
| 0.7381944444444444 | 160.056 |
| 0.7388888888888889 | 160.056 |
| 0.7395833333333334 | 160.056 |
| 0.7402777777777777 | 160.056 |
| 0.7409722222222223 | 160.056 |
| 0.7416666666666667 | 155.509 |
| 0.7423611111111111 | 155.509 |
| 0.7430555555555555 | 155.509 |
| 0.74375 | 155.509 |
| 0.7444444444444445 | 155.509 |
| 0.7451388888888889 | 155.509 |
| 0.7458333333333332 | 155.509 |
| 0.7465277777777778 | 155.509 |
| 0.7472222222222222 | 155.509 |
| 0.7479166666666667 | 155.509 |
| 0.748611111111111 | 160.056 |
| 0.7493055555555556 | 160.056 |
| 0.75 | 160.056 |
| 0.7506944444444444 | 160.056 |
| 0.751388888888889 | 160.056 |
| 0.7520833333333333 | 160.056 |
| 0.7527777777777778 | 160.056 |
| 0.7534722222222222 | 160.056 |
| 0.7541666666666668 | 155.509 |
| 0.7548611111111111 | 155.509 |
| 0.7555555555555555 | 155.509 |
| 0.75625 | 150.964 |
| 0.7569444444444445 | 150.964 |
| 0.7576388888888889 | 146.423 |
| 0.7583333333333333 | 146.423 |
| 0.7590277777777777 | 141.884 |
| 0.7597222222222223 | 137.347 |
| 0.7604166666666666 | 132.814 |
| 0.7611111111111111 | 128.284 |
| 0.7618055555555556 | 128.284 |
| 0.7625000000000001 | 128.284 |
| 0.7631944444444444 | 123.758 |
| 0.7638888888888888 | 123.758 |
| 0.7645833333333334 | 123.758 |
| 0.7652777777777778 | 123.758 |
| 0.7659722222222222 | 123.758 |
| 0.7666666666666666 | 119.235 |
| 0.7673611111111112 | 114.716 |
| 0.7680555555555556 | 114.716 |
| 0.7687499999999999 | 110.201 |
| 0.7694444444444444 | 110.201 |
| 0.7701388888888889 | 110.201 |
| 0.7708333333333334 | 105.69 |
| 0.7715277777777777 | 105.69 |
| 0.7722222222222223 | 105.69 |
| 0.7729166666666667 | 105.69 |
| 0.7736111111111111 | 105.69 |
| 0.7743055555555555 | 101.184 |
| 0.775 | 101.184 |
| 0.7756944444444445 | 101.184 |
| 0.7763888888888889 | 101.184 |
| 0.7770833333333332 | 96.682 |
| 0.7777777777777778 | 96.682 |
| 0.7784722222222222 | 96.682 |
| 0.7791666666666667 | 96.682 |
| 0.779861111111111 | 96.682 |
| 0.7805555555555556 | 92.184 |
| 0.78125 | 92.184 |
| 0.7819444444444444 | 92.184 |
| 0.782638888888889 | 92.184 |
| 0.7833333333333333 | 92.184 |
| 0.7840277777777778 | 92.184 |
| 0.7847222222222222 | 92.184 |
| 0.7854166666666668 | 87.692 |
| 0.7861111111111111 | 87.692 |
| 0.7868055555555555 | 87.692 |
| 0.7875 | 87.692 |
| 0.7881944444444445 | 83.205 |
| 0.7888888888888889 | 83.205 |
| 0.7895833333333333 | 83.205 |
| 0.7902777777777777 | 83.205 |
| 0.7909722222222223 | 78.722 |
| 0.7916666666666666 | 78.722 |
| 0.7923611111111111 | 78.722 |
| 0.7930555555555556 | 78.722 |
| 0.7937500000000001 | 74.246 |
| 0.7944444444444444 | 74.246 |
| 0.7951388888888888 | 74.246 |
| 0.7958333333333334 | 74.246 |
| 0.7965277777777778 | 74.246 |
| 0.7972222222222222 | 69.775 |
| 0.7979166666666666 | 69.775 |
| 0.7986111111111112 | 69.775 |
| 0.7993055555555556 | 69.775 |
| 0.7999999999999999 | 65.31 |
| 0.8006944444444444 | 65.31 |
| 0.8013888888888889 | 65.31 |
| 0.8020833333333334 | 65.31 |
| 0.8027777777777777 | 65.31 |
| 0.8034722222222223 | 65.31 |
| 0.8041666666666667 | 65.31 |
| 0.8048611111111111 | 60.85 |
| 0.8055555555555555 | 60.85 |
| 0.80625 | 60.85 |
| 0.8069444444444445 | 60.85 |
| 0.8076388888888889 | 56.398 |
| 0.8083333333333332 | 56.398 |
| 0.8090277777777778 | 56.398 |
| 0.8097222222222222 | 56.398 |
| 0.8104166666666667 | 56.398 |
| 0.811111111111111 | 56.398 |
| 0.8118055555555556 | 56.398 |
| 0.8125 | 51.951 |
| 0.8131944444444444 | 51.951 |
| 0.813888888888889 | 51.951 |
| 0.8145833333333333 | 51.951 |
| 0.8152777777777778 | 47.511 |
| 0.8159722222222222 | 47.511 |
| 0.8166666666666668 | 47.511 |
| 0.8173611111111111 | 47.511 |
| 0.8180555555555555 | 47.511 |
| 0.81875 | 47.511 |
| 0.8194444444444445 | 43.079 |
| 0.8201388888888889 | 43.079 |
| 0.8208333333333333 | 43.079 |
| 0.8215277777777777 | 43.079 |
| 0.8222222222222223 | 38.653 |
| 0.8229166666666666 | 38.653 |
| 0.8236111111111111 | 38.653 |
| 0.8243055555555556 | 38.653 |
| 0.8250000000000001 | 38.653 |
| 0.8256944444444444 | 38.653 |
| 0.8263888888888888 | 34.234 |
| 0.8270833333333334 | 34.234 |
| 0.8277777777777778 | 34.234 |
| 0.8284722222222222 | 29.823 |
| 0.8291666666666666 | 29.823 |
| 0.8298611111111112 | 29.823 |
| 0.8305555555555556 | 29.823 |
| 0.8312499999999999 | 29.823 |
| 0.8319444444444444 | 29.823 |
| 0.8326388888888889 | 25.419 |
| 0.8333333333333334 | 25.419 |
| 0.8340277777777777 | 25.419 |
| 0.8347222222222223 | 25.419 |
| 0.8354166666666667 | 21.024 |
| 0.8361111111111111 | 21.024 |
| 0.8368055555555555 | 21.024 |
| 0.8375 | 21.024 |
| 0.8381944444444445 | 16.636 |
| 0.8388888888888889 | 16.636 |
| 0.8395833333333332 | 16.636 |
| 0.8402777777777778 | 16.636 |
| 0.8409722222222222 | 12.257 |
| 0.8416666666666667 | 12.257 |
| 0.842361111111111 | 12.257 |
| 0.8430555555555556 | 7.887 |
| 0.84375 | 7.887 |
| 0.8444444444444444 | 7.887 |
| 0.845138888888889 | 7.887 |
| 0.8458333333333333 | 3.525 |
| 0.8465277777777778 | 7.887 |
| 0.8472222222222222 | 3.525 |
| 0.8479166666666668 | 3.525 |
| 0.8486111111111111 | 3.525 |
| 0.8493055555555555 | 3.525 |
| 0.85 | 3.525 |
| 0.8506944444444445 | 3.525 |
| 0.8513888888888889 | 3.525 |
| 0.8520833333333333 | 3.525 |
| 0.8527777777777777 | 3.525 |
| 0.8534722222222223 | 3.525 |
| 0.8541666666666666 | 0 |
| 0.8548611111111111 | 0 |
| 0.8555555555555556 | 0 |
| 0.8562500000000001 | 0 |
| 0.8569444444444444 | 0 |
| 0.8576388888888888 | 0 |
| 0.8583333333333334 | 0 |
| 0.8590277777777778 | 0 |
| 0.8597222222222222 | 0 |
| 0.8604166666666666 | 0 |
| 0.8611111111111112 | 0 |
| 0.8618055555555556 | 0 |
| 0.8624999999999999 | 0 |
| 0.8631944444444444 | 0 |
| 0.8638888888888889 | 0 |
| 0.8645833333333334 | 0 |
| 0.8652777777777777 | 0 |
| 0.8659722222222223 | 0 |
| 0.8666666666666667 | 0 |
| 0.8673611111111111 | 0 |
| 0.8680555555555555 | 0 |
| 0.86875 | 0 |
| 0.8694444444444445 | 0 |
| 0.8701388888888889 | 0 |
| 0.8708333333333332 | 0 |
| 0.8715277777777778 | 0 |
| 0.8722222222222222 | 0 |
| 0.8729166666666667 | 0 |
| 0.873611111111111 | 0 |
| 0.8743055555555556 | 0 |
| 0.875 | 0 |
| 0.8756944444444444 | 0 |
| 0.876388888888889 | 0 |
| 0.8770833333333333 | 0 |
| 0.8777777777777778 | 0 |
| 0.8784722222222222 | 0 |
| 0.8791666666666668 | 0 |
| 0.8798611111111111 | 0 |
| 0.8805555555555555 | 0 |
| 0.88125 | 0 |
| 0.8819444444444445 | 0 |
| 0.8826388888888889 | 0 |
| 0.8833333333333333 | 0 |
| 0.8840277777777777 | 0 |
| 0.8847222222222223 | 0 |
| 0.8854166666666666 | 0 |
| 0.8861111111111111 | 0 |
| 0.8868055555555556 | 0 |
| 0.8875000000000001 | 0 |
| 0.8881944444444444 | 0 |
| 0.8888888888888888 | 0 |
| 0.8895833333333334 | 0 |
| 0.8902777777777778 | 0 |
| 0.8909722222222222 | 0 |
| 0.8916666666666666 | 0 |
| 0.8923611111111112 | 0 |
| 0.8930555555555556 | 0 |
| 0.8937499999999999 | 0 |
| 0.8944444444444444 | 0 |
| 0.8951388888888889 | 0 |
| 0.8958333333333334 | 0 |
| 0.8965277777777777 | 0 |
| 0.8972222222222223 | 0 |
| 0.8979166666666667 | 0 |
| 0.8986111111111111 | 0 |
| 0.8993055555555555 | 0 |
| 0.9 | 0 |
| 0.9006944444444445 | 0 |
| 0.9013888888888889 | 0 |
| 0.9020833333333332 | 0 |
| 0.9027777777777778 | 0 |
| 0.9034722222222222 | 0 |
| 0.9041666666666667 | 0 |
| 0.904861111111111 | 0 |
| 0.9055555555555556 | 0 |
| 0.90625 | 0 |
| 0.9069444444444444 | 0 |
| 0.907638888888889 | 0 |
| 0.9083333333333333 | 0 |
| 0.9090277777777778 | 0 |
| 0.9097222222222222 | 0 |
| 0.9104166666666668 | 0 |
| 0.9111111111111111 | 0 |
| 0.9118055555555555 | 0 |
| 0.9125 | 0 |
| 0.9131944444444445 | 0 |
| 0.9138888888888889 | 0 |
| 0.9145833333333333 | 0 |
| 0.9152777777777777 | 0 |
| 0.9159722222222223 | 0 |
| 0.9166666666666666 | 0 |
| 0.9173611111111111 | 0 |
| 0.9180555555555556 | 0 |
| 0.9187500000000001 | 0 |
| 0.9194444444444444 | 0 |
| 0.9201388888888888 | 0 |
| 0.9208333333333334 | 0 |
| 0.9215277777777778 | 0 |
| 0.9222222222222222 | 0 |
| 0.9229166666666666 | 0 |
| 0.9236111111111112 | 0 |
| 0.9243055555555556 | 0 |
| 0.9249999999999999 | 0 |
| 0.9256944444444444 | 0 |
| 0.9263888888888889 | 0 |
| 0.9270833333333334 | 0 |
| 0.9277777777777777 | 0 |
| 0.9284722222222223 | 0 |
| 0.9291666666666667 | 0 |
| 0.9298611111111111 | 0 |
| 0.9305555555555555 | 0 |
| 0.93125 | 0 |
| 0.9319444444444445 | 0 |
| 0.9326388888888889 | 0 |
| 0.9333333333333332 | 0 |
| 0.9340277777777778 | 0 |
| 0.9347222222222222 | 0 |
| 0.9354166666666667 | 0 |
| 0.936111111111111 | 0 |
| 0.9368055555555556 | 0 |
| 0.9375 | 0 |
| 0.9381944444444444 | 0 |
| 0.938888888888889 | 0 |
| 0.9395833333333333 | 0 |
| 0.9402777777777778 | 0 |
| 0.9409722222222222 | 0 |
| 0.9416666666666668 | 0 |
| 0.9423611111111111 | 0 |
| 0.9430555555555555 | 0 |
| 0.94375 | 0 |
| 0.9444444444444445 | 0 |
| 0.9451388888888889 | 0 |
| 0.9458333333333333 | 0 |
| 0.9465277777777777 | 0 |
| 0.9472222222222223 | 0 |
| 0.9479166666666666 | 0 |
| 0.9486111111111111 | 0 |
| 0.9493055555555556 | 0 |
| 0.9500000000000001 | 0 |
| 0.9506944444444444 | 0 |
| 0.9513888888888888 | 0 |
| 0.9520833333333334 | 0 |
| 0.9527777777777778 | 0 |
| 0.9534722222222222 | 0 |
| 0.9541666666666666 | 0 |
| 0.9548611111111112 | 0 |
| 0.9555555555555556 | 0 |
| 0.9562499999999999 | 0 |
| 0.9569444444444444 | 0 |
| 0.9576388888888889 | 0 |
| 0.9583333333333334 | 0 |
| 0.9590277777777777 | 0 |
| 0.9597222222222223 | 0 |
| 0.9604166666666667 | 0 |
| 0.9611111111111111 | 0 |
| 0.9618055555555555 | 0 |
| 0.9625 | 0 |
| 0.9631944444444445 | 0 |
| 0.9638888888888889 | 0 |
| 0.9645833333333332 | 0 |
| 0.9652777777777778 | 0 |
| 0.9659722222222222 | 0 |
| 0.9666666666666667 | 0 |
| 0.967361111111111 | 0 |
| 0.9680555555555556 | 0 |
| 0.96875 | 0 |
| 0.9694444444444444 | 0 |
| 0.970138888888889 | 0 |
| 0.9708333333333333 | 0 |
| 0.9715277777777778 | 0 |
| 0.9722222222222222 | 0 |
| 0.9729166666666668 | 0 |
| 0.9736111111111111 | 0 |
| 0.9743055555555555 | 0 |
| 0.975 | 0 |
| 0.9756944444444445 | 0 |
| 0.9763888888888889 | 0 |
| 0.9770833333333333 | 0 |
| 0.9777777777777777 | 0 |
| 0.9784722222222223 | 0 |
| 0.9791666666666666 | 0 |
| 0.9798611111111111 | 0 |
| 0.9805555555555556 | 0 |
| 0.9812500000000001 | 0 |
| 0.9819444444444444 | 0 |
| 0.9826388888888888 | 0 |
| 0.9833333333333334 | 0 |
| 0.9840277777777778 | 0 |
| 0.9847222222222222 | 0 |
| 0.9854166666666666 | 0 |
| 0.9861111111111112 | 0 |
| 0.9868055555555556 | 0 |
| 0.9874999999999999 | 0 |
| 0.9881944444444444 | 0 |
| 0.9888888888888889 | 0 |
| 0.9895833333333334 | 0 |
| 0.9902777777777777 | 0 |
| 0.9909722222222223 | 0 |
| 0.9916666666666667 | 0 |
| 0.9923611111111111 | 0 |
| 0.9930555555555555 | 0 |
| 0.99375 | 0 |
| 0.9944444444444445 | 0 |
| 0.9951388888888889 | 0 |
| 0.9958333333333332 | 0 |
| 0.9965277777777778 | 0 |
| 0.9972222222222222 | 0 |
| 0.9979166666666667 | 0 |
| 0.998611111111111 | 0 |
| 0.9993055555555556 | 0 |